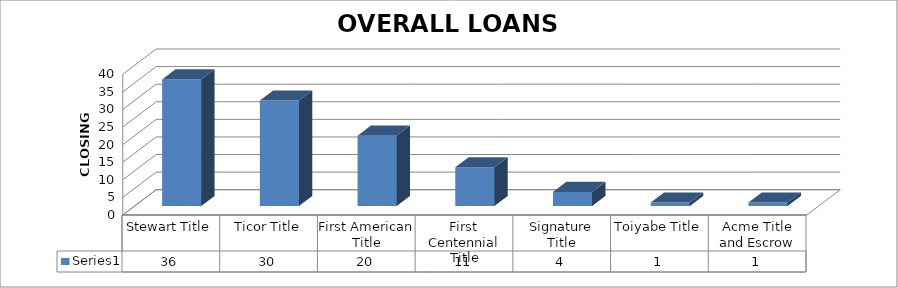
| Category | Series 0 |
|---|---|
| Stewart Title | 36 |
| Ticor Title | 30 |
| First American Title | 20 |
| First Centennial Title | 11 |
| Signature Title | 4 |
| Toiyabe Title | 1 |
| Acme Title and Escrow | 1 |